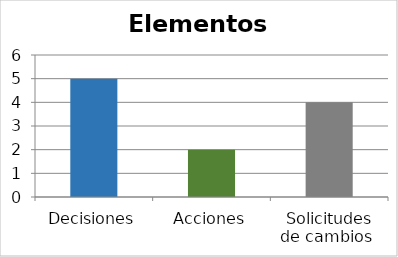
| Category | Series 0 |
|---|---|
| Decisiones | 5 |
| Acciones | 2 |
| Solicitudes de cambios  | 4 |